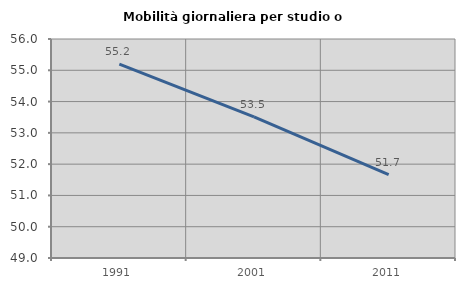
| Category | Mobilità giornaliera per studio o lavoro |
|---|---|
| 1991.0 | 55.199 |
| 2001.0 | 53.511 |
| 2011.0 | 51.668 |